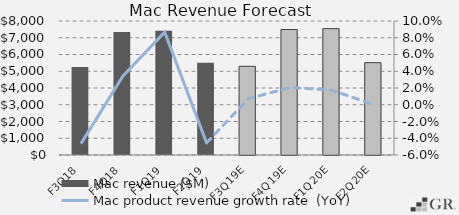
| Category | Mac revenue ($M) |
|---|---|
|  F3Q18  | 5258 |
|  F4Q18  | 7340 |
|  F1Q19  | 7416 |
|  F2Q19  | 5513 |
|  F3Q19E  | 5295.979 |
|  F4Q19E  | 7491.374 |
|  F1Q20E  | 7544.048 |
|  F2Q20E  | 5512.42 |